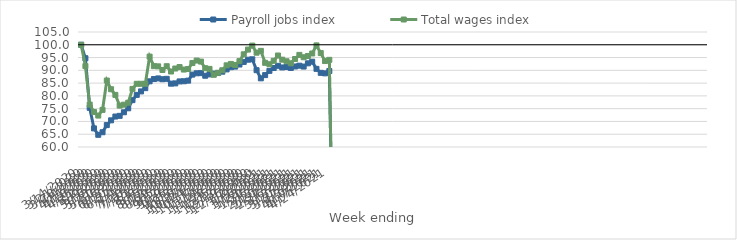
| Category | Payroll jobs index | Total wages index |
|---|---|---|
| 14/03/2020 | 100 | 100 |
| 21/03/2020 | 94.736 | 91.649 |
| 28/03/2020 | 75.333 | 76.601 |
| 04/04/2020 | 67.285 | 73.696 |
| 11/04/2020 | 64.774 | 72.298 |
| 18/04/2020 | 65.776 | 74.525 |
| 25/04/2020 | 68.573 | 86.006 |
| 02/05/2020 | 70.434 | 82.592 |
| 09/05/2020 | 71.922 | 80.395 |
| 16/05/2020 | 72.189 | 76.192 |
| 23/05/2020 | 73.592 | 76.563 |
| 30/05/2020 | 75.15 | 77.323 |
| 06/06/2020 | 78.332 | 82.744 |
| 13/06/2020 | 80.398 | 84.735 |
| 20/06/2020 | 81.752 | 84.735 |
| 27/06/2020 | 83.027 | 84.736 |
| 04/07/2020 | 85.705 | 95.375 |
| 11/07/2020 | 86.596 | 91.645 |
| 18/07/2020 | 86.838 | 91.556 |
| 25/07/2020 | 86.517 | 90.14 |
| 01/08/2020 | 86.679 | 91.618 |
| 08/08/2020 | 84.782 | 89.538 |
| 15/08/2020 | 84.893 | 90.708 |
| 22/08/2020 | 85.664 | 91.286 |
| 29/08/2020 | 85.726 | 90.303 |
| 05/09/2020 | 85.965 | 90.5 |
| 12/09/2020 | 88.326 | 92.842 |
| 19/09/2020 | 88.847 | 93.826 |
| 26/09/2020 | 88.897 | 93.426 |
| 03/10/2020 | 87.886 | 90.827 |
| 10/10/2020 | 88.416 | 90.565 |
| 17/10/2020 | 88.711 | 88.25 |
| 24/10/2020 | 88.937 | 89.048 |
| 31/10/2020 | 89.465 | 90.037 |
| 07/11/2020 | 90.369 | 91.953 |
| 14/11/2020 | 91.23 | 92.505 |
| 21/11/2020 | 91.469 | 92.089 |
| 28/11/2020 | 92.27 | 93.606 |
| 05/12/2020 | 93.285 | 96.271 |
| 12/12/2020 | 94.165 | 98.119 |
| 19/12/2020 | 94.324 | 99.678 |
| 26/12/2020 | 90.058 | 96.91 |
| 02/01/2021 | 86.868 | 97.624 |
| 09/01/2021 | 88.126 | 92.938 |
| 16/01/2021 | 89.789 | 92.388 |
| 23/01/2021 | 90.902 | 93.729 |
| 30/01/2021 | 91.773 | 95.802 |
| 06/02/2021 | 91.127 | 94.168 |
| 13/02/2021 | 91.301 | 93.553 |
| 20/02/2021 | 90.932 | 92.756 |
| 27/02/2021 | 91.51 | 94.434 |
| 06/03/2021 | 91.82 | 96.04 |
| 13/03/2021 | 91.473 | 95.118 |
| 20/03/2021 | 92.745 | 95.617 |
| 27/03/2021 | 93.381 | 96.597 |
| 03/04/2021 | 90.578 | 99.755 |
| 10/04/2021 | 89.015 | 96.744 |
| 17/04/2021 | 88.82 | 93.63 |
| 24/04/2021 | 89.716 | 94.11 |